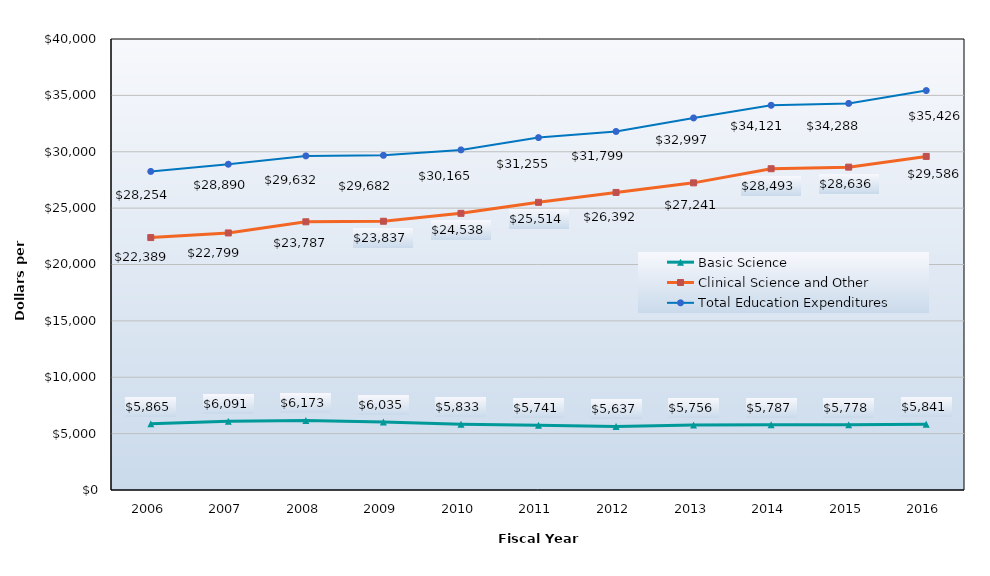
| Category | Basic Science | Clinical Science and Other | Total Education Expenditures |
|---|---|---|---|
| 2006.0 | 5865 | 22389 | 28254 |
| 2007.0 | 6091 | 22799 | 28890 |
| 2008.0 | 6173 | 23787 | 29632 |
| 2009.0 | 6035 | 23837 | 29682 |
| 2010.0 | 5833 | 24538 | 30165 |
| 2011.0 | 5741 | 25514 | 31255 |
| 2012.0 | 5637 | 26392 | 31799 |
| 2013.0 | 5756 | 27241 | 32997 |
| 2014.0 | 5787 | 28493 | 34121 |
| 2015.0 | 5778 | 28636 | 34288 |
| 2016.0 | 5841 | 29586 | 35426 |